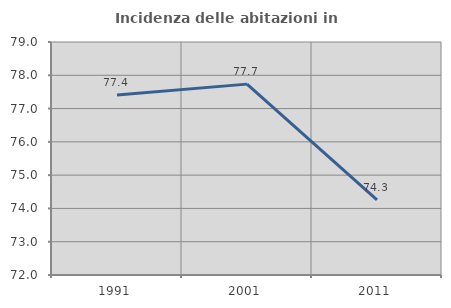
| Category | Incidenza delle abitazioni in proprietà  |
|---|---|
| 1991.0 | 77.406 |
| 2001.0 | 77.734 |
| 2011.0 | 74.254 |